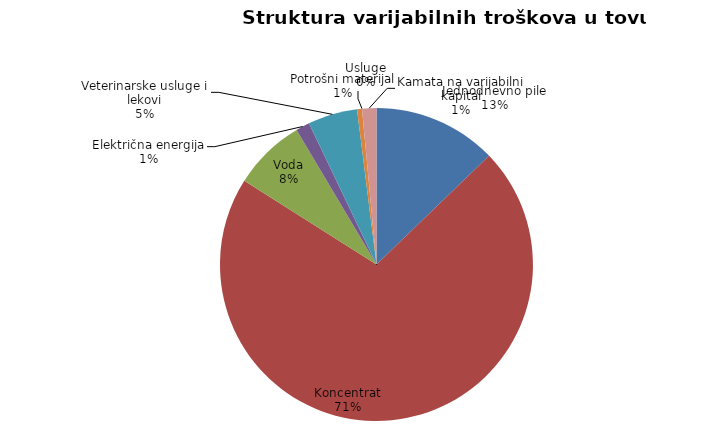
| Category | Series 0 |
|---|---|
| Jednodnevno pile | 52.632 |
| Koncentrat | 293.116 |
| Voda | 30.789 |
| Električna energija | 5.895 |
| Veterinarske usluge i lekovi | 21.053 |
| Potrošni materijal | 2.105 |
| Usluge | 0 |
| Kamata na varijabilni kapital | 6.084 |